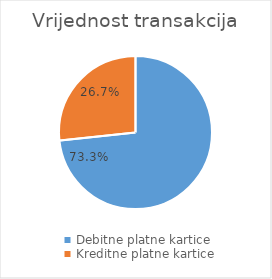
| Category | Vrijednost transakcija |
|---|---|
| Debitne platne kartice | 59742390772 |
| Kreditne platne kartice | 21752518845 |